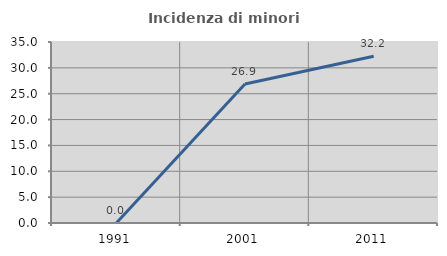
| Category | Incidenza di minori stranieri |
|---|---|
| 1991.0 | 0 |
| 2001.0 | 26.875 |
| 2011.0 | 32.249 |